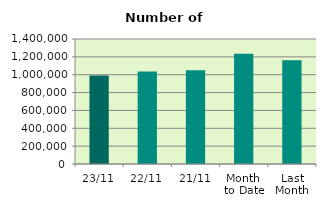
| Category | Series 0 |
|---|---|
| 23/11 | 992168 |
| 22/11 | 1036964 |
| 21/11 | 1049438 |
| Month 
to Date | 1235984.588 |
| Last
Month | 1161301.714 |